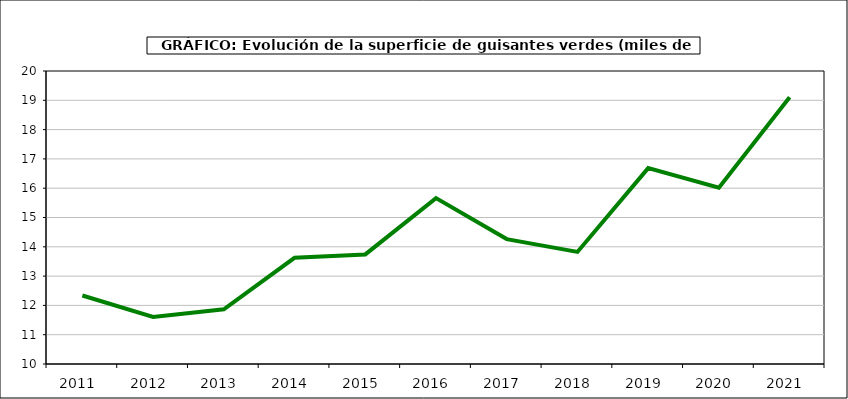
| Category | superficie |
|---|---|
| 2011.0 | 12.338 |
| 2012.0 | 11.604 |
| 2013.0 | 11.867 |
| 2014.0 | 13.624 |
| 2015.0 | 13.74 |
| 2016.0 | 15.663 |
| 2017.0 | 14.263 |
| 2018.0 | 13.825 |
| 2019.0 | 16.686 |
| 2020.0 | 16.02 |
| 2021.0 | 19.105 |